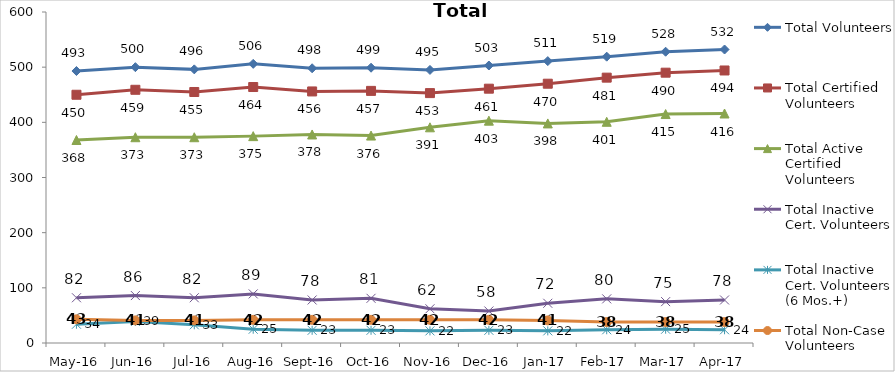
| Category | Total Volunteers | Total Certified Volunteers | Total Active Certified Volunteers | Total Inactive Cert. Volunteers | Total Inactive Cert. Volunteers (6 Mos.+) | Total Non-Case Volunteers |
|---|---|---|---|---|---|---|
| May-16 | 493 | 450 | 368 | 82 | 34 | 43 |
| Jun-16 | 500 | 459 | 373 | 86 | 39 | 41 |
| Jul-16 | 496 | 455 | 373 | 82 | 33 | 41 |
| Aug-16 | 506 | 464 | 375 | 89 | 25 | 42 |
| Sep-16 | 498 | 456 | 378 | 78 | 23 | 42 |
| Oct-16 | 499 | 457 | 376 | 81 | 23 | 42 |
| Nov-16 | 495 | 453 | 391 | 62 | 22 | 42 |
| Dec-16 | 503 | 461 | 403 | 58 | 23 | 42 |
| Jan-17 | 511 | 470 | 398 | 72 | 22 | 41 |
| Feb-17 | 519 | 481 | 401 | 80 | 24 | 38 |
| Mar-17 | 528 | 490 | 415 | 75 | 25 | 38 |
| Apr-17 | 532 | 494 | 416 | 78 | 24 | 38 |